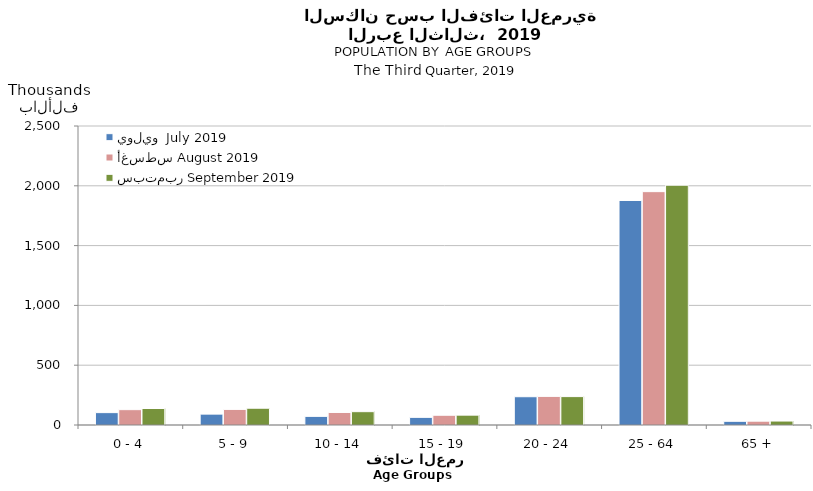
| Category | يوليو  July 2019 | أغسطس August 2019  | سبتمبر September 2019  |
|---|---|---|---|
| 0 - 4 | 103381 | 128192 | 137890 |
| 5 - 9 | 91007 | 130275 | 140229 |
| 10 - 14 | 72234 | 104716 | 111377 |
| 15 - 19 | 63961 | 81484 | 82364 |
| 20 - 24 | 236378 | 239263 | 237405 |
| 25 - 64 | 1877156 | 1951082 | 2004867 |
| 65 + | 30946 | 31926 | 33150 |